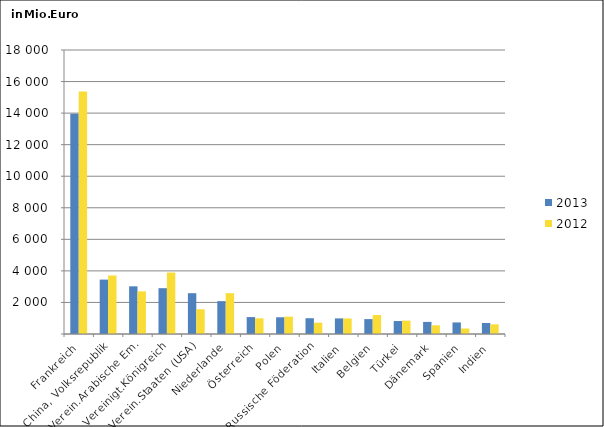
| Category | 2013 | 2012 |
|---|---|---|
| Frankreich | 13958.588 | 15370.153 |
| China, Volksrepublik | 3447.4 | 3709.779 |
| Verein.Arabische Em. | 3021.902 | 2701.426 |
| Vereinigt.Königreich | 2903.678 | 3894.6 |
| Verein.Staaten (USA) | 2585.729 | 1568.766 |
| Niederlande | 2082.012 | 2584.595 |
| Österreich | 1072.503 | 992.543 |
| Polen | 1059.456 | 1101.03 |
| Russische Föderation | 1000.119 | 715.347 |
| Italien | 988.888 | 984.653 |
| Belgien | 944.362 | 1204.898 |
| Türkei | 822.146 | 847.456 |
| Dänemark | 765.312 | 550.78 |
| Spanien | 732.477 | 349.082 |
| Indien | 697.325 | 611.467 |